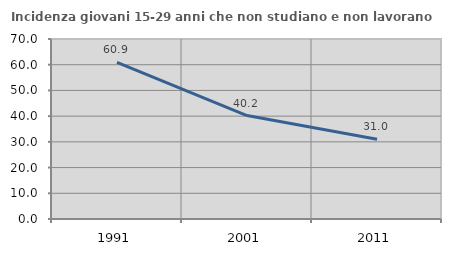
| Category | Incidenza giovani 15-29 anni che non studiano e non lavorano  |
|---|---|
| 1991.0 | 60.874 |
| 2001.0 | 40.214 |
| 2011.0 | 30.997 |